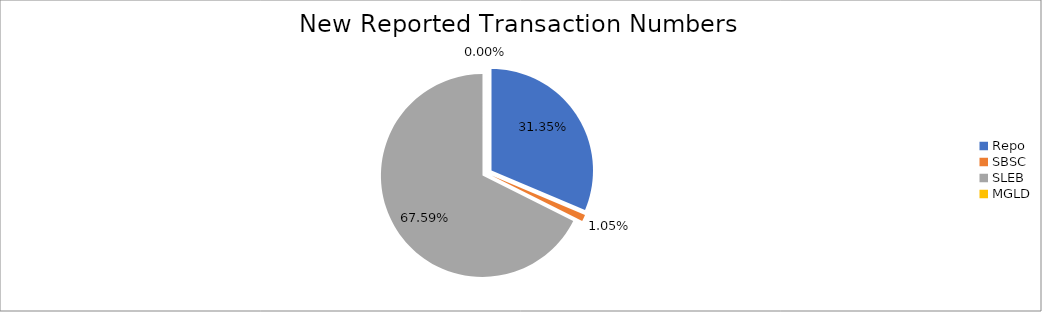
| Category | Series 0 |
|---|---|
| Repo | 315374 |
| SBSC | 10601 |
| SLEB | 679906 |
| MGLD | 36 |